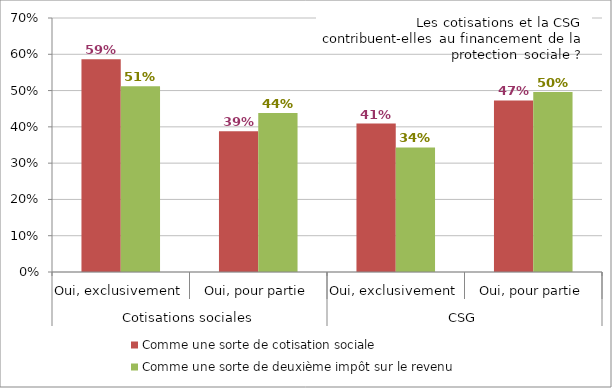
| Category | Comme une sorte de cotisation sociale  | Comme une sorte de deuxième impôt sur le revenu  |
|---|---|---|
| 0 | 0.586 | 0.512 |
| 1 | 0.388 | 0.438 |
| 2 | 0.409 | 0.343 |
| 3 | 0.473 | 0.496 |